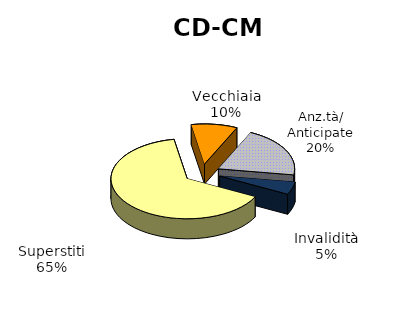
| Category | Series 0 |
|---|---|
| Vecchiaia | 1951 |
| Anz.tà/ Anticipate | 4089 |
| Invalidità | 1016 |
| Superstiti | 12950 |